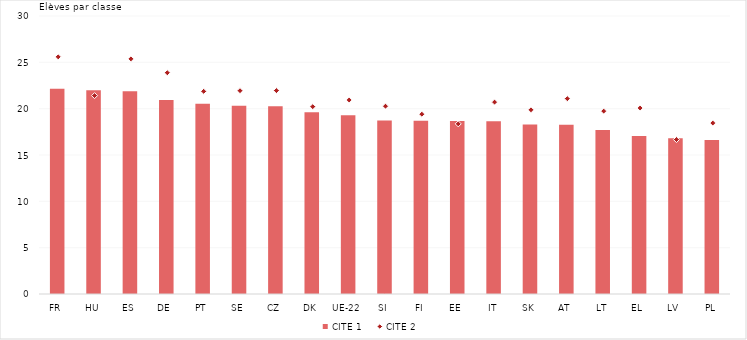
| Category | CITE 1 |
|---|---|
| FR | 22.142 |
| HU | 22 |
| ES | 21.867 |
| DE | 20.937 |
| PT | 20.525 |
| SE | 20.303 |
| CZ | 20.27 |
| DK | 19.621 |
| UE-22 | 19.284 |
| SI | 18.724 |
| FI | 18.693 |
| EE | 18.672 |
| IT | 18.655 |
| SK | 18.296 |
| AT | 18.255 |
| LT | 17.698 |
| EL | 17.047 |
| LV | 16.795 |
| PL | 16.607 |